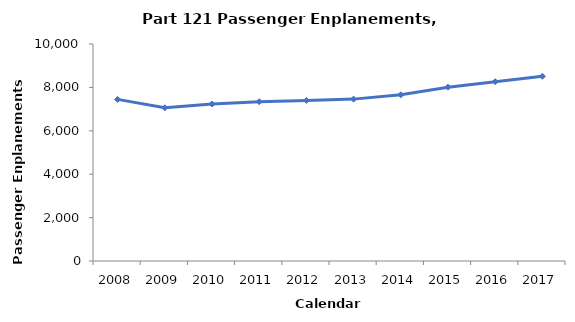
| Category | Passengers (100,000s) |
|---|---|
| 2008.0 | 7448.246 |
| 2009.0 | 7061.064 |
| 2010.0 | 7232.912 |
| 2011.0 | 7341.547 |
| 2012.0 | 7399.775 |
| 2013.0 | 7459.964 |
| 2014.0 | 7660.432 |
| 2015.0 | 8010.834 |
| 2016.0 | 8263.329 |
| 2017.0 | 8513.017 |